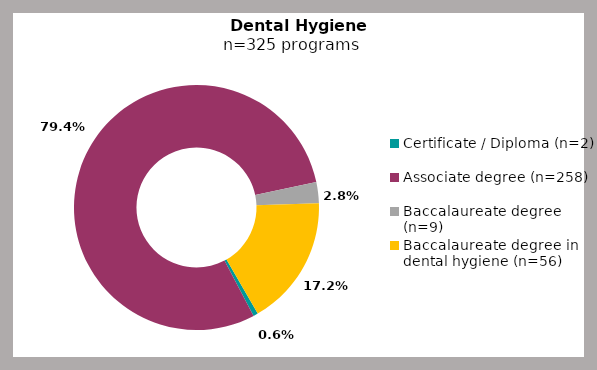
| Category | Series 0 |
|---|---|
| Certificate / Diploma (n=2) | 0.006 |
| Associate degree (n=258) | 0.794 |
| Baccalaureate degree (n=9) | 0.028 |
| Baccalaureate degree in dental hygiene (n=56) | 0.172 |